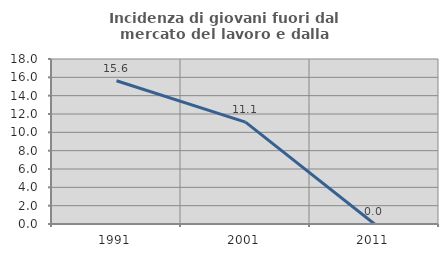
| Category | Incidenza di giovani fuori dal mercato del lavoro e dalla formazione  |
|---|---|
| 1991.0 | 15.625 |
| 2001.0 | 11.111 |
| 2011.0 | 0 |